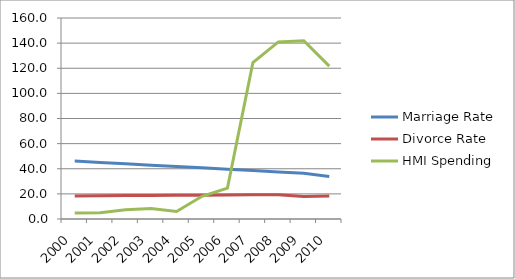
| Category | Marriage Rate | Divorce Rate | HMI Spending |
|---|---|---|---|
| 2000.0 | 46.1 | 18.37 | 4.728 |
| 2001.0 | 45.025 | 18.495 | 4.964 |
| 2002.0 | 43.95 | 18.62 | 7.398 |
| 2003.0 | 42.875 | 18.745 | 8.259 |
| 2004.0 | 41.8 | 18.87 | 5.983 |
| 2005.0 | 40.725 | 18.995 | 18.097 |
| 2006.0 | 39.65 | 19.12 | 24.547 |
| 2007.0 | 38.575 | 19.245 | 124.576 |
| 2008.0 | 37.5 | 19.4 | 140.983 |
| 2009.0 | 36.4 | 18 | 141.922 |
| 2010.0 | 33.9 | 18.4 | 121.725 |